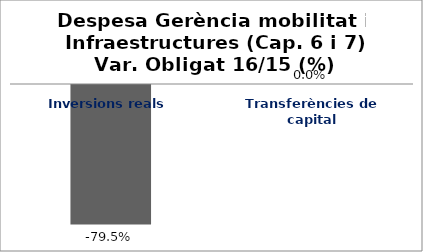
| Category | Series 0 |
|---|---|
| Inversions reals | -0.795 |
| Transferències de capital | 0 |